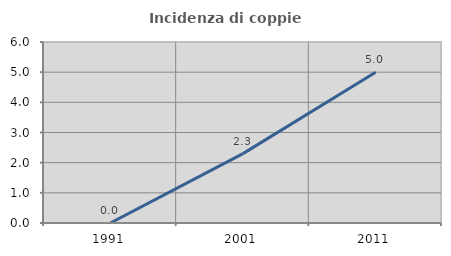
| Category | Incidenza di coppie miste |
|---|---|
| 1991.0 | 0 |
| 2001.0 | 2.299 |
| 2011.0 | 5 |